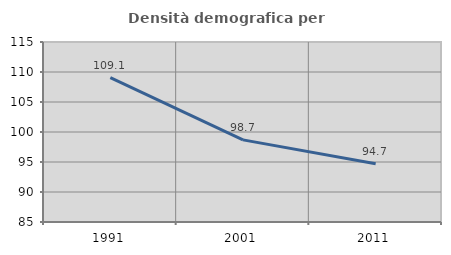
| Category | Densità demografica |
|---|---|
| 1991.0 | 109.074 |
| 2001.0 | 98.689 |
| 2011.0 | 94.705 |